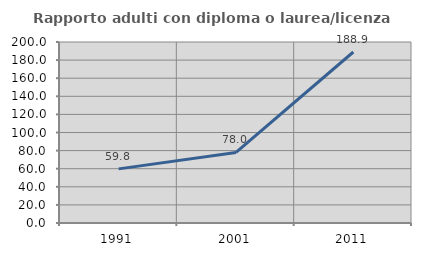
| Category | Rapporto adulti con diploma o laurea/licenza media  |
|---|---|
| 1991.0 | 59.816 |
| 2001.0 | 77.97 |
| 2011.0 | 188.946 |